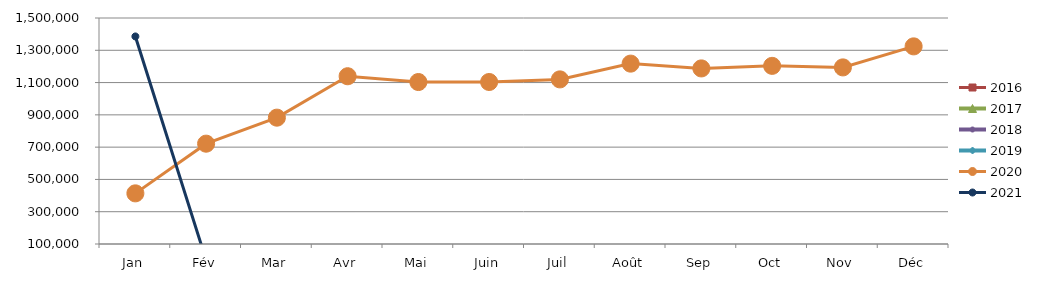
| Category | 2015 | 2016 | 2017 | 2018 | 2019 | 2020 | 2021 |
|---|---|---|---|---|---|---|---|
| Jan |  | 0 | 0 | 0 | 0 | 413718.973 | 1385841.188 |
| Fév |  | 0 | 0 | 0 | 0 | 721421.241 | 0 |
| Mar |  | 0 | 0 | 0 | 0 | 882604.122 | 0 |
| Avr |  | 0 | 0 | 0 | 0 | 1139215.204 | 0 |
| Mai |  | 0 | 0 | 0 | 0 | 1103343.599 | 0 |
| Juin |  | 0 | 0 | 0 | 0 | 1103576.761 | 0 |
| Juil |  | 0 | 0 | 0 | 0 | 1119722.736 | 0 |
| Août |  | 0 | 0 | 0 | 0 | 1217354.798 | 0 |
| Sep |  | 0 | 0 | 0 | 0 | 1187669.872 | 0 |
| Oct |  | 0 | 0 | 0 | 0 | 1203449.934 | 0 |
| Nov |  | 0 | 0 | 0 | 0 | 1194014.644 | 0 |
| Déc |  | 0 | 0 | 0 | 0 | 1324311.651 | 0 |